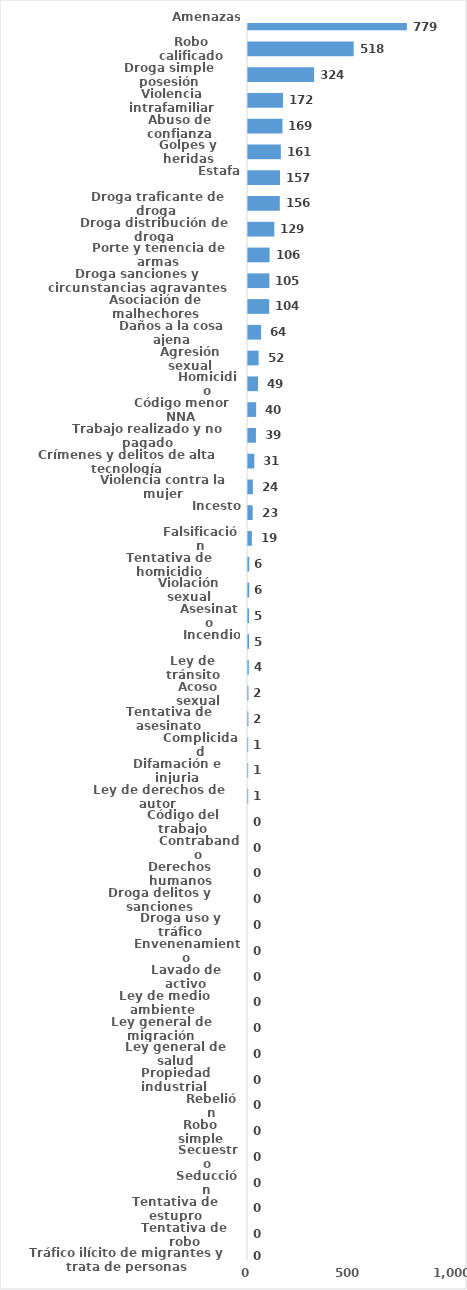
| Category | Series 0 |
|---|---|
| Amenazas | 779 |
| Robo calificado | 518 |
| Droga simple posesión | 324 |
| Violencia intrafamiliar | 172 |
| Abuso de confianza | 169 |
| Golpes y heridas | 161 |
| Estafa | 157 |
| Droga traficante de droga  | 156 |
| Droga distribución de droga | 129 |
| Porte y tenencia de armas | 106 |
| Droga sanciones y circunstancias agravantes | 105 |
| Asociación de malhechores | 104 |
| Daños a la cosa ajena | 64 |
| Agresión sexual | 52 |
| Homicidio | 49 |
| Código menor NNA | 40 |
| Trabajo realizado y no pagado | 39 |
| Crímenes y delitos de alta tecnología | 31 |
| Violencia contra la mujer | 24 |
| Incesto | 23 |
| Falsificación | 19 |
| Tentativa de homicidio | 6 |
| Violación sexual | 6 |
| Asesinato | 5 |
| Incendio | 5 |
| Ley de tránsito | 4 |
| Acoso sexual | 2 |
| Tentativa de asesinato | 2 |
| Complicidad | 1 |
| Difamación e injuria | 1 |
| Ley de derechos de autor  | 1 |
| Código del trabajo | 0 |
| Contrabando | 0 |
| Derechos humanos | 0 |
| Droga delitos y sanciones | 0 |
| Droga uso y tráfico | 0 |
| Envenenamiento | 0 |
| Lavado de activo | 0 |
| Ley de medio ambiente  | 0 |
| Ley general de migración | 0 |
| Ley general de salud | 0 |
| Propiedad industrial  | 0 |
| Rebelión | 0 |
| Robo simple | 0 |
| Secuestro | 0 |
| Seducción | 0 |
| Tentativa de estupro | 0 |
| Tentativa de robo | 0 |
| Tráfico ilícito de migrantes y trata de personas | 0 |